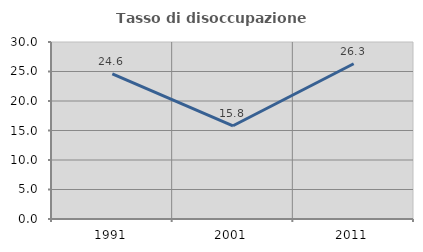
| Category | Tasso di disoccupazione giovanile  |
|---|---|
| 1991.0 | 24.609 |
| 2001.0 | 15.802 |
| 2011.0 | 26.316 |